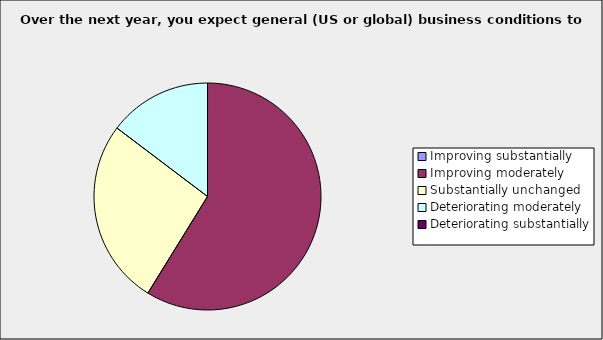
| Category | Series 0 |
|---|---|
| Improving substantially | 0 |
| Improving moderately | 0.588 |
| Substantially unchanged | 0.265 |
| Deteriorating moderately | 0.147 |
| Deteriorating substantially | 0 |